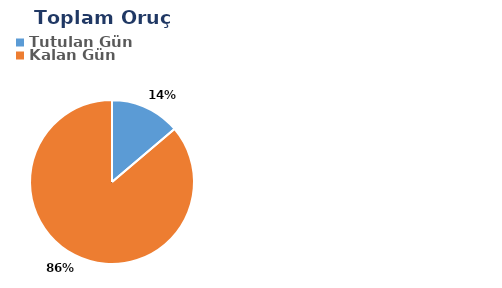
| Category | Toplam |
|---|---|
| Tutulan Gün | 4 |
| Kalan Gün | 25 |